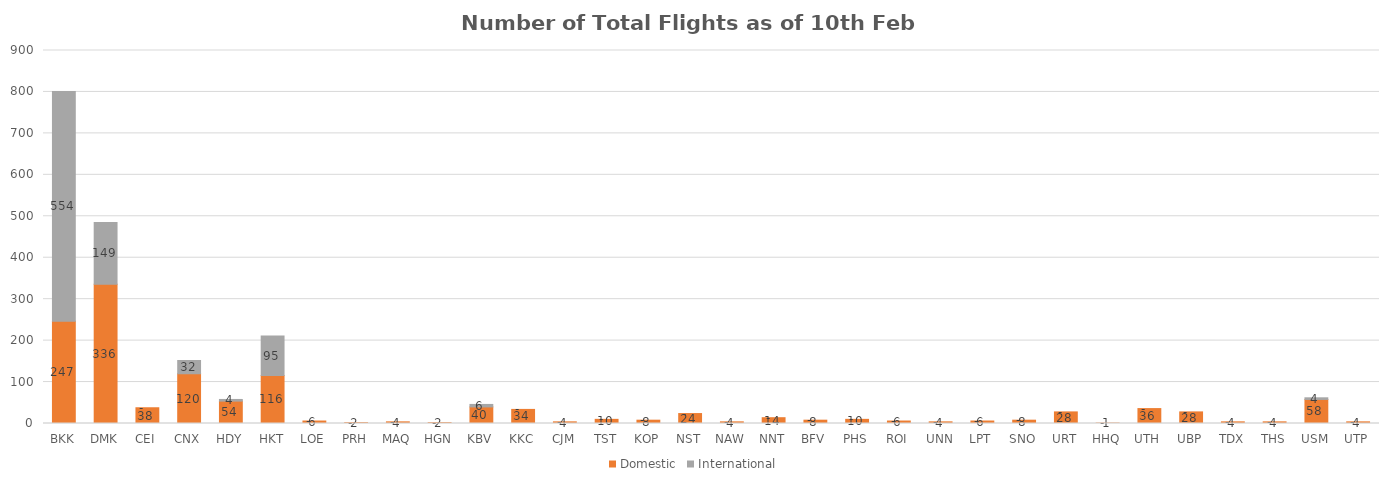
| Category | Domestic | International |
|---|---|---|
| BKK | 247 | 554 |
| DMK | 336 | 149 |
| CEI | 38 | 0 |
| CNX | 120 | 32 |
| HDY | 54 | 4 |
| HKT | 116 | 95 |
| LOE | 6 | 0 |
| PRH | 2 | 0 |
| MAQ | 4 | 0 |
| HGN | 2 | 0 |
| KBV | 40 | 6 |
| KKC | 34 | 0 |
| CJM | 4 | 0 |
| TST | 10 | 0 |
| KOP | 8 | 0 |
| NST | 24 | 0 |
| NAW | 4 | 0 |
| NNT | 14 | 0 |
| BFV | 8 | 0 |
| PHS | 10 | 0 |
| ROI | 6 | 0 |
| UNN | 4 | 0 |
| LPT | 6 | 0 |
| SNO | 8 | 0 |
| URT | 28 | 0 |
| HHQ | 1 | 0 |
| UTH | 36 | 0 |
| UBP | 28 | 0 |
| TDX | 4 | 0 |
| THS | 4 | 0 |
| USM | 58 | 4 |
| UTP | 4 | 0 |